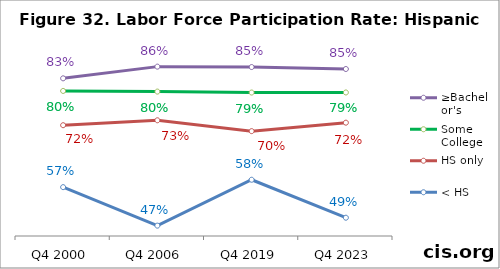
| Category | ≥Bachelor's | Some College | HS only | < HS |
|---|---|---|---|---|
| Q4 2000 | 0.827 | 0.797 | 0.715 | 0.567 |
| Q4 2006 | 0.855 | 0.796 | 0.727 | 0.475 |
| Q4 2019 | 0.854 | 0.793 | 0.701 | 0.585 |
| Q4 2023 | 0.85 | 0.794 | 0.721 | 0.494 |